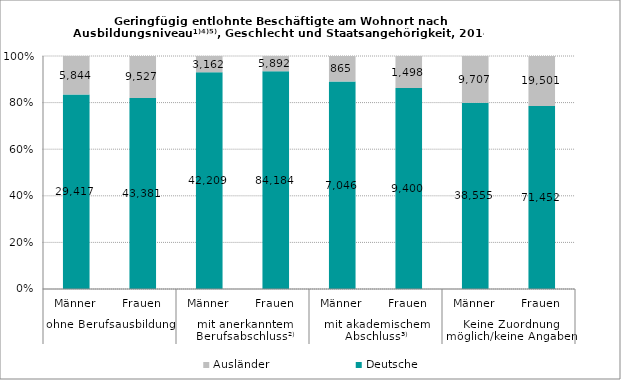
| Category | Deutsche | Ausländer |
|---|---|---|
| 0 | 29417 | 5844 |
| 1 | 43381 | 9527 |
| 2 | 42209 | 3162 |
| 3 | 84184 | 5892 |
| 4 | 7046 | 865 |
| 5 | 9400 | 1498 |
| 6 | 38555 | 9707 |
| 7 | 71452 | 19501 |